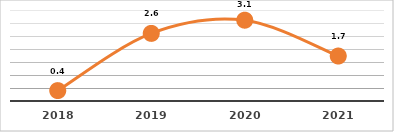
| Category | COBERTURA DE BECADOS EXTERNOS (%)
PRIMER TRIMESTRE, EJERCICIO 2021 |
|---|---|
| 2018.0 | 0.4 |
| 2019.0 | 2.6 |
| 2020.0 | 3.108 |
| 2021.0 | 1.73 |